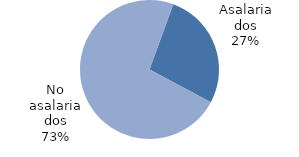
| Category | 743 |
|---|---|
| Asalariados | 743.227 |
| No asalariados | 1984.471 |